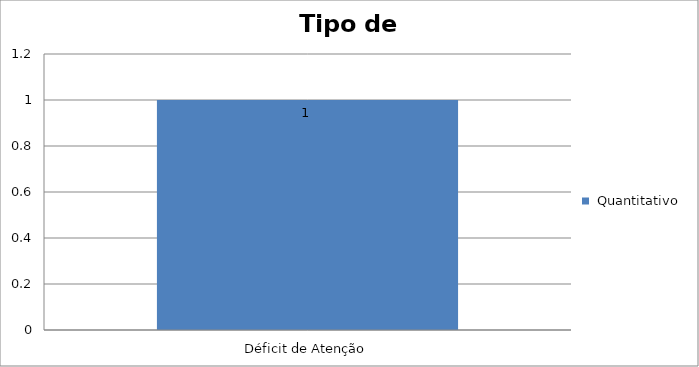
| Category |  Quantitativo |
|---|---|
| Déficit de Atenção | 1 |